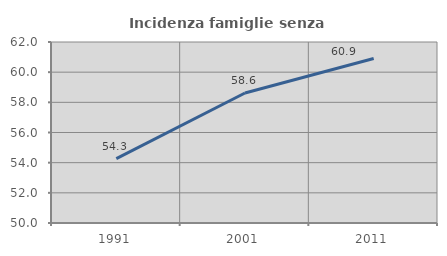
| Category | Incidenza famiglie senza nuclei |
|---|---|
| 1991.0 | 54.264 |
| 2001.0 | 58.621 |
| 2011.0 | 60.909 |